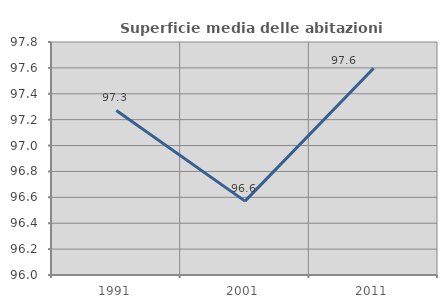
| Category | Superficie media delle abitazioni occupate |
|---|---|
| 1991.0 | 97.271 |
| 2001.0 | 96.571 |
| 2011.0 | 97.597 |